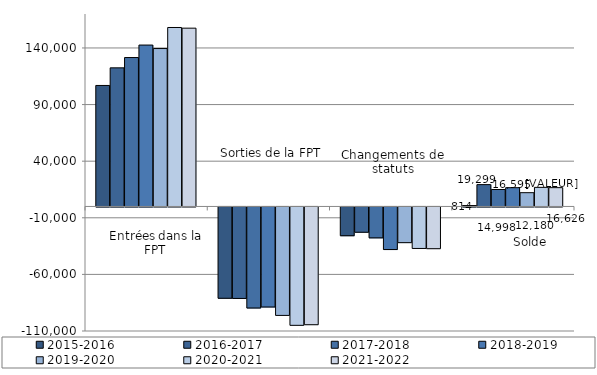
| Category | 2015-2016 | 2016-2017 | 2017-2018 | 2018-2019 | 2019-2020 | 2020-2021 | 2021-2022 |
|---|---|---|---|---|---|---|---|
| Entrées | 106875 | 122431 | 131541 | 142570 | 139488 | 158076 | 157488 |
| Sorties | -80653 | -80800 | -89253 | -88369 | -95789 | -104562 | -104002 |
| Changement de statut | -25408 | -22332 | -27290 | -37606 | -31519 | -36651 | -36860 |
| Solde | 814 | 19299 | 14998 | 16595 | 12180 | 16863 | 16626 |